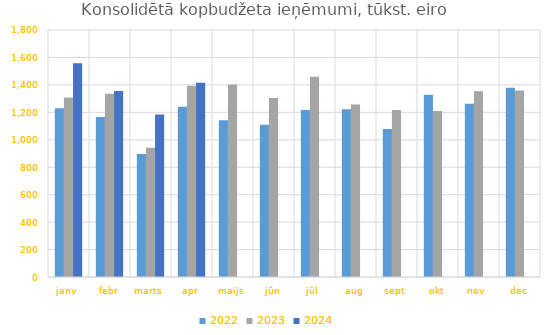
| Category | 2022 | 2023 | 2024 |
|---|---|---|---|
| janv | 1230170.047 | 1307495.685 | 1557359.802 |
| febr | 1166379.907 | 1335076.73 | 1355056.454 |
| marts | 896198.796 | 941933.145 | 1183497.744 |
| apr | 1240480.294 | 1392983.428 | 1415647.644 |
| maijs | 1141583.555 | 1402498.183 | 0 |
| jūn | 1110073.881 | 1304045.598 | 0 |
| jūl | 1217508.617 | 1459749.866 | 0 |
| aug | 1222030.584 | 1257876.494 | 0 |
| sept | 1079167.695 | 1217869.498 | 0 |
| okt | 1328712.607 | 1209805.903 | 0 |
| nov | 1261934.438 | 1354090.244 | 0 |
| dec | 1379607.658 | 1358321.803 | 0 |